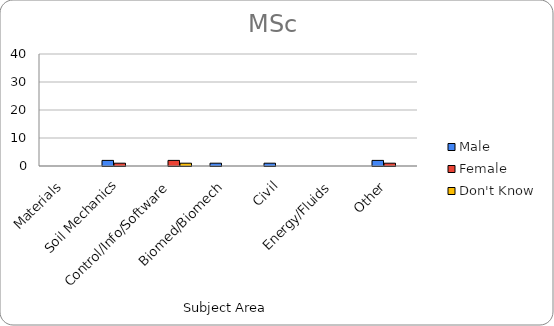
| Category | Male | Female | Don't Know |
|---|---|---|---|
| Materials | 0 | 0 | 0 |
| Soil Mechanics | 2 | 1 | 0 |
| Control/Info/Software | 0 | 2 | 1 |
| Biomed/Biomech | 1 | 0 | 0 |
| Civil | 1 | 0 | 0 |
| Energy/Fluids | 0 | 0 | 0 |
| Other | 2 | 1 | 0 |